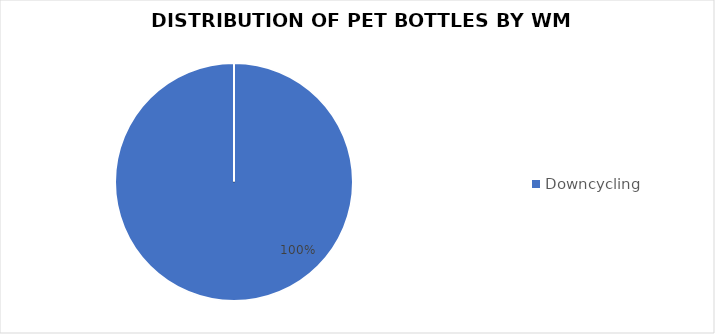
| Category | Series 0 |
|---|---|
| Downcycling | 6674 |